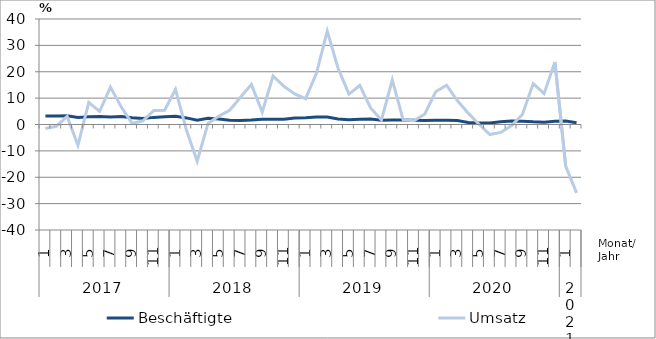
| Category | Beschäftigte | Umsatz |
|---|---|---|
| 0 | 3.2 | -1.5 |
| 1 | 3.2 | -0.7 |
| 2 | 3.3 | 3.1 |
| 3 | 2.7 | -7.9 |
| 4 | 2.9 | 8.4 |
| 5 | 3 | 5 |
| 6 | 2.8 | 14.2 |
| 7 | 3 | 6.6 |
| 8 | 2.6 | 0.4 |
| 9 | 2.3 | 1.4 |
| 10 | 2.7 | 5.3 |
| 11 | 2.9 | 5.4 |
| 12 | 3.1 | 13.3 |
| 13 | 2.5 | -2 |
| 14 | 1.6 | -13.9 |
| 15 | 2.4 | 0.4 |
| 16 | 2.1 | 3.2 |
| 17 | 1.6 | 5.4 |
| 18 | 1.5 | 10.3 |
| 19 | 1.7 | 15.2 |
| 20 | 2 | 4.7 |
| 21 | 2 | 18.4 |
| 22 | 2 | 14.5 |
| 23 | 2.5 | 11.6 |
| 24 | 2.6 | 9.8 |
| 25 | 2.8 | 19.4 |
| 26 | 2.8 | 35.4 |
| 27 | 2.1 | 21.3 |
| 28 | 1.8 | 11.5 |
| 29 | 2 | 14.8 |
| 30 | 2.1 | 6.3 |
| 31 | 1.6 | 1.7 |
| 32 | 1.7 | 16.9 |
| 33 | 1.7 | 1.8 |
| 34 | 1.6 | 1.4 |
| 35 | 1.5 | 4 |
| 36 | 1.6 | 12.4 |
| 37 | 1.6 | 14.9 |
| 38 | 1.5 | 9.1 |
| 39 | 0.8 | 4.3 |
| 40 | 0.6 | 0.1 |
| 41 | 0.6 | -3.8 |
| 42 | 1 | -3 |
| 43 | 1.3 | -0.4 |
| 44 | 1.2 | 3.8 |
| 45 | 1 | 15.5 |
| 46 | 0.9 | 11.7 |
| 47 | 1.2 | 23.7 |
| 48 | 1.3 | -15.9 |
| 49 | 0.7 | -25.9 |